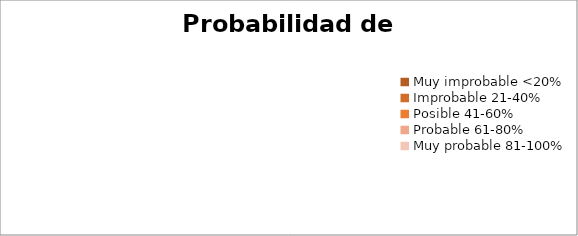
| Category | Series 0 |
|---|---|
| Muy improbable <20% | 0 |
| Improbable 21-40% | 0 |
| Posible 41-60% | 0 |
| Probable 61-80% | 0 |
| Muy probable 81-100% | 0 |